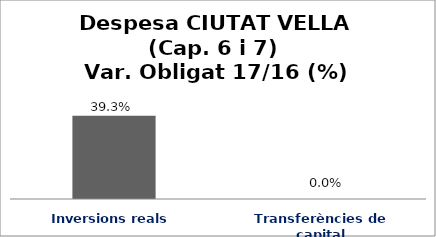
| Category | Series 0 |
|---|---|
| Inversions reals | 0.393 |
| Transferències de capital | 0 |